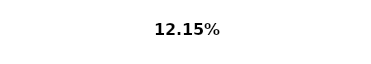
| Category | Series 0 |
|---|---|
| 0 | 0.122 |